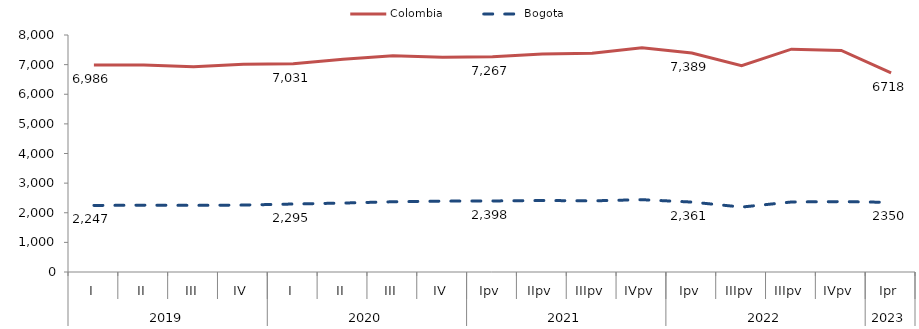
| Category | Colombia | Bogota |
|---|---|---|
| 0 | 6986.028 | 2247.095 |
| 1 | 6987.888 | 2255.594 |
| 2 | 6928.501 | 2248.39 |
| 3 | 7012.46 | 2259.472 |
| 4 | 7031.197 | 2294.598 |
| 5 | 7183.975 | 2327.144 |
| 6 | 7295.907 | 2370.6 |
| 7 | 7248.026 | 2392.098 |
| 8 | 7266.897 | 2398.201 |
| 9 | 7361.573 | 2413.932 |
| 10 | 7387.8 | 2401.222 |
| 11 | 7567.395 | 2441.157 |
| 12 | 7389.409 | 2360.788 |
| 13 | 6965.905 | 2191.852 |
| 14 | 7522.348 | 2363.248 |
| 15 | 7480.41 | 2375.82 |
| 16 | 6718 | 2350 |